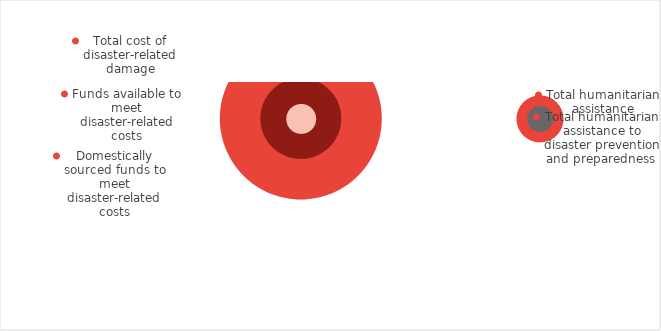
| Category | Series 0 |
|---|---|
| 1.0 | 1 |
| 1.0 | 1 |
| 1.0 | 1 |
| 2.0 | 1 |
| 2.0 | 1 |